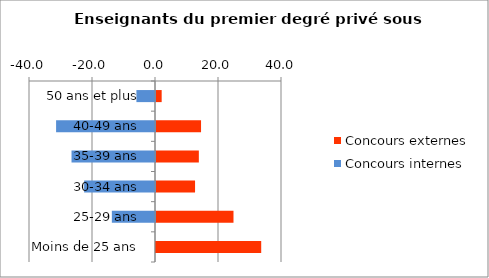
| Category | Concours externes | Concours internes |
|---|---|---|
| 50 ans et plus | 1.8 | -5.9 |
| 40-49 ans | 14.3 | -31.4 |
| 35-39 ans | 13.6 | -26.5 |
| 30-34 ans | 12.4 | -22.5 |
| 25-29 ans | 24.6 | -13.7 |
| Moins de 25 ans | 33.4 | 0 |